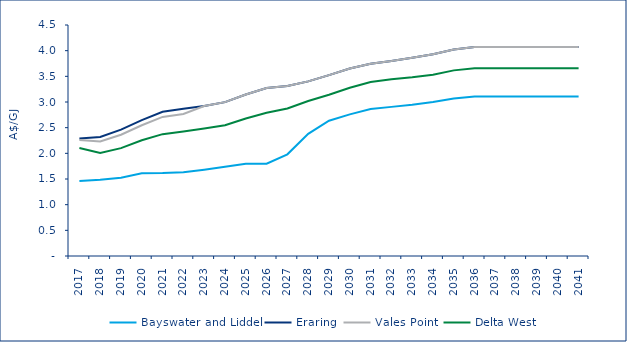
| Category | Bayswater and Liddel | Eraring | Vales Point | Delta West |
|---|---|---|---|---|
| 2017.0 | 1.463 | 2.29 | 2.262 | 2.104 |
| 2018.0 | 1.485 | 2.32 | 2.231 | 2.009 |
| 2019.0 | 1.526 | 2.462 | 2.362 | 2.101 |
| 2020.0 | 1.61 | 2.647 | 2.547 | 2.256 |
| 2021.0 | 1.615 | 2.809 | 2.709 | 2.374 |
| 2022.0 | 1.63 | 2.867 | 2.767 | 2.425 |
| 2023.0 | 1.681 | 2.923 | 2.923 | 2.482 |
| 2024.0 | 1.737 | 2.997 | 2.997 | 2.547 |
| 2025.0 | 1.797 | 3.147 | 3.147 | 2.68 |
| 2026.0 | 1.799 | 3.273 | 3.273 | 2.79 |
| 2027.0 | 1.981 | 3.31 | 3.31 | 2.873 |
| 2028.0 | 2.38 | 3.402 | 3.402 | 3.02 |
| 2029.0 | 2.636 | 3.524 | 3.524 | 3.142 |
| 2030.0 | 2.759 | 3.654 | 3.654 | 3.277 |
| 2031.0 | 2.863 | 3.746 | 3.746 | 3.391 |
| 2032.0 | 2.905 | 3.797 | 3.797 | 3.442 |
| 2033.0 | 2.946 | 3.862 | 3.862 | 3.481 |
| 2034.0 | 2.998 | 3.929 | 3.929 | 3.531 |
| 2035.0 | 3.07 | 4.023 | 4.023 | 3.616 |
| 2036.0 | 3.107 | 4.071 | 4.071 | 3.659 |
| 2037.0 | 3.107 | 4.071 | 4.071 | 3.659 |
| 2038.0 | 3.107 | 4.071 | 4.071 | 3.659 |
| 2039.0 | 3.107 | 4.071 | 4.071 | 3.659 |
| 2040.0 | 3.107 | 4.071 | 4.071 | 3.659 |
| 2041.0 | 3.107 | 4.071 | 4.071 | 3.659 |